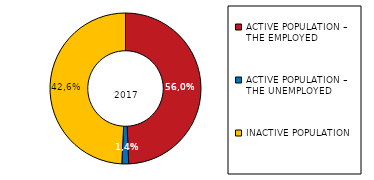
| Category | Series 2 |
|---|---|
| ACTIVE POPULATION – 
THE EMPLOYED | 5221604.795 |
| ACTIVE POPULATION – 
THE UNEMPLOYED | 155535.278 |
| INACTIVE POPULATION | 5210105.911 |